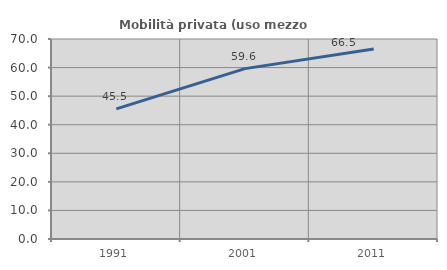
| Category | Mobilità privata (uso mezzo privato) |
|---|---|
| 1991.0 | 45.527 |
| 2001.0 | 59.629 |
| 2011.0 | 66.495 |